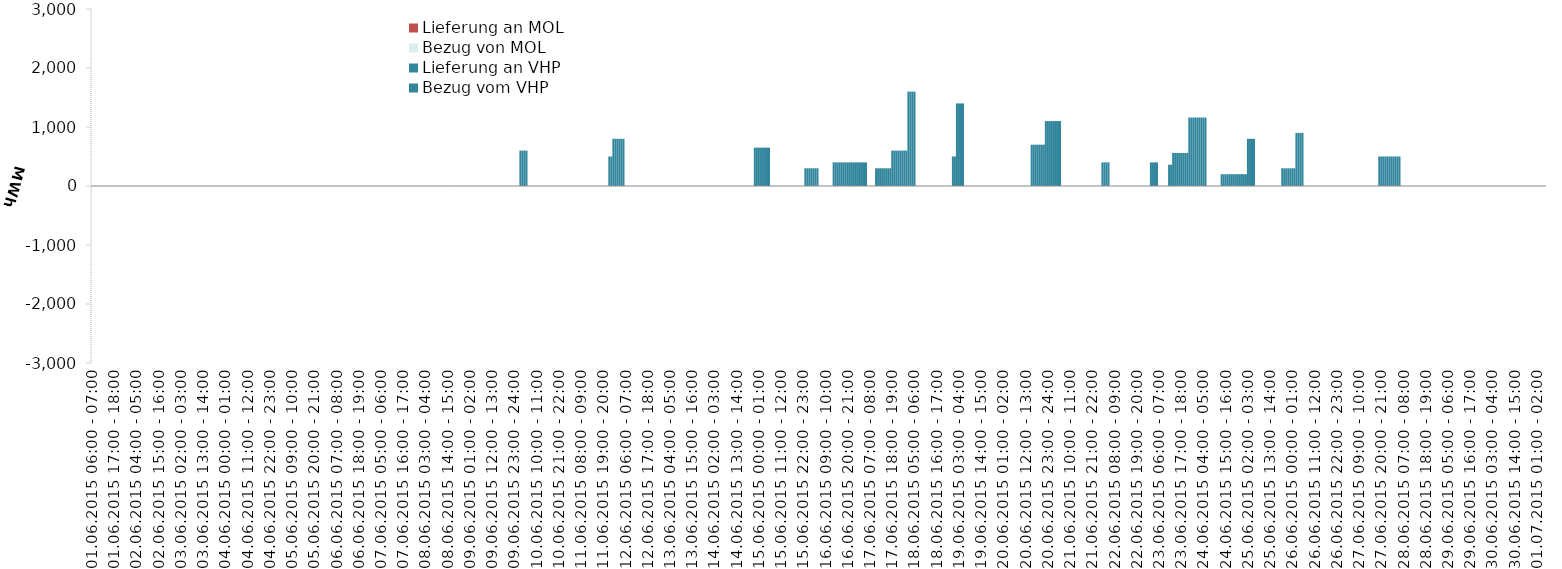
| Category | Bezug vom VHP | Lieferung an VHP | Bezug von MOL | Lieferung an MOL |
|---|---|---|---|---|
| 01.06.2015 06:00 - 07:00 | 0 | 0 | 0 | 0 |
| 01.06.2015 07:00 - 08:00 | 0 | 0 | 0 | 0 |
| 01.06.2015 08:00 - 09:00 | 0 | 0 | 0 | 0 |
| 01.06.2015 09:00 - 10:00 | 0 | 0 | 0 | 0 |
| 01.06.2015 10:00 - 11:00 | 0 | 0 | 0 | 0 |
| 01.06.2015 11:00 - 12:00 | 0 | 0 | 0 | 0 |
| 01.06.2015 12:00 - 13:00 | 0 | 0 | 0 | 0 |
| 01.06.2015 13:00 - 14:00 | 0 | 0 | 0 | 0 |
| 01.06.2015 14:00 - 15:00 | 0 | 0 | 0 | 0 |
| 01.06.2015 15:00 - 16:00 | 0 | 0 | 0 | 0 |
| 01.06.2015 16:00 - 17:00 | 0 | 0 | 0 | 0 |
| 01.06.2015 17:00 - 18:00 | 0 | 0 | 0 | 0 |
| 01.06.2015 18:00 - 19:00 | 0 | 0 | 0 | 0 |
| 01.06.2015 19:00 - 20:00 | 0 | 0 | 0 | 0 |
| 01.06.2015 20:00 - 21:00 | 0 | 0 | 0 | 0 |
| 01.06.2015 21:00 - 22:00 | 0 | 0 | 0 | 0 |
| 01.06.2015 22:00 - 23:00 | 0 | 0 | 0 | 0 |
| 01.06.2015 23:00 - 24:00 | 0 | 0 | 0 | 0 |
| 02.06.2015 00:00 - 01:00 | 0 | 0 | 0 | 0 |
| 02.06.2015 01:00 - 02:00 | 0 | 0 | 0 | 0 |
| 02.06.2015 02:00 - 03:00 | 0 | 0 | 0 | 0 |
| 02.06.2015 03:00 - 04:00 | 0 | 0 | 0 | 0 |
| 02.06.2015 04:00 - 05:00 | 0 | 0 | 0 | 0 |
| 02.06.2015 05:00 - 06:00 | 0 | 0 | 0 | 0 |
| 02.06.2015 06:00 - 07:00 | 0 | 0 | 0 | 0 |
| 02.06.2015 07:00 - 08:00 | 0 | 0 | 0 | 0 |
| 02.06.2015 08:00 - 09:00 | 0 | 0 | 0 | 0 |
| 02.06.2015 09:00 - 10:00 | 0 | 0 | 0 | 0 |
| 02.06.2015 10:00 - 11:00 | 0 | 0 | 0 | 0 |
| 02.06.2015 11:00 - 12:00 | 0 | 0 | 0 | 0 |
| 02.06.2015 12:00 - 13:00 | 0 | 0 | 0 | 0 |
| 02.06.2015 13:00 - 14:00 | 0 | 0 | 0 | 0 |
| 02.06.2015 14:00 - 15:00 | 0 | 0 | 0 | 0 |
| 02.06.2015 15:00 - 16:00 | 0 | 0 | 0 | 0 |
| 02.06.2015 16:00 - 17:00 | 0 | 0 | 0 | 0 |
| 02.06.2015 17:00 - 18:00 | 0 | 0 | 0 | 0 |
| 02.06.2015 18:00 - 19:00 | 0 | 0 | 0 | 0 |
| 02.06.2015 19:00 - 20:00 | 0 | 0 | 0 | 0 |
| 02.06.2015 20:00 - 21:00 | 0 | 0 | 0 | 0 |
| 02.06.2015 21:00 - 22:00 | 0 | 0 | 0 | 0 |
| 02.06.2015 22:00 - 23:00 | 0 | 0 | 0 | 0 |
| 02.06.2015 23:00 - 24:00 | 0 | 0 | 0 | 0 |
| 03.06.2015 00:00 - 01:00 | 0 | 0 | 0 | 0 |
| 03.06.2015 01:00 - 02:00 | 0 | 0 | 0 | 0 |
| 03.06.2015 02:00 - 03:00 | 0 | 0 | 0 | 0 |
| 03.06.2015 03:00 - 04:00 | 0 | 0 | 0 | 0 |
| 03.06.2015 04:00 - 05:00 | 0 | 0 | 0 | 0 |
| 03.06.2015 05:00 - 06:00 | 0 | 0 | 0 | 0 |
| 03.06.2015 06:00 - 07:00 | 0 | 0 | 0 | 0 |
| 03.06.2015 07:00 - 08:00 | 0 | 0 | 0 | 0 |
| 03.06.2015 08:00 - 09:00 | 0 | 0 | 0 | 0 |
| 03.06.2015 09:00 - 10:00 | 0 | 0 | 0 | 0 |
| 03.06.2015 10:00 - 11:00 | 0 | 0 | 0 | 0 |
| 03.06.2015 11:00 - 12:00 | 0 | 0 | 0 | 0 |
| 03.06.2015 12:00 - 13:00 | 0 | 0 | 0 | 0 |
| 03.06.2015 13:00 - 14:00 | 0 | 0 | 0 | 0 |
| 03.06.2015 14:00 - 15:00 | 0 | 0 | 0 | 0 |
| 03.06.2015 15:00 - 16:00 | 0 | 0 | 0 | 0 |
| 03.06.2015 16:00 - 17:00 | 0 | 0 | 0 | 0 |
| 03.06.2015 17:00 - 18:00 | 0 | 0 | 0 | 0 |
| 03.06.2015 18:00 - 19:00 | 0 | 0 | 0 | 0 |
| 03.06.2015 19:00 - 20:00 | 0 | 0 | 0 | 0 |
| 03.06.2015 20:00 - 21:00 | 0 | 0 | 0 | 0 |
| 03.06.2015 21:00 - 22:00 | 0 | 0 | 0 | 0 |
| 03.06.2015 22:00 - 23:00 | 0 | 0 | 0 | 0 |
| 03.06.2015 23:00 - 24:00 | 0 | 0 | 0 | 0 |
| 04.06.2015 00:00 - 01:00 | 0 | 0 | 0 | 0 |
| 04.06.2015 01:00 - 02:00 | 0 | 0 | 0 | 0 |
| 04.06.2015 02:00 - 03:00 | 0 | 0 | 0 | 0 |
| 04.06.2015 03:00 - 04:00 | 0 | 0 | 0 | 0 |
| 04.06.2015 04:00 - 05:00 | 0 | 0 | 0 | 0 |
| 04.06.2015 05:00 - 06:00 | 0 | 0 | 0 | 0 |
| 04.06.2015 06:00 - 07:00 | 0 | 0 | 0 | 0 |
| 04.06.2015 07:00 - 08:00 | 0 | 0 | 0 | 0 |
| 04.06.2015 08:00 - 09:00 | 0 | 0 | 0 | 0 |
| 04.06.2015 09:00 - 10:00 | 0 | 0 | 0 | 0 |
| 04.06.2015 10:00 - 11:00 | 0 | 0 | 0 | 0 |
| 04.06.2015 11:00 - 12:00 | 0 | 0 | 0 | 0 |
| 04.06.2015 12:00 - 13:00 | 0 | 0 | 0 | 0 |
| 04.06.2015 13:00 - 14:00 | 0 | 0 | 0 | 0 |
| 04.06.2015 14:00 - 15:00 | 0 | 0 | 0 | 0 |
| 04.06.2015 15:00 - 16:00 | 0 | 0 | 0 | 0 |
| 04.06.2015 16:00 - 17:00 | 0 | 0 | 0 | 0 |
| 04.06.2015 17:00 - 18:00 | 0 | 0 | 0 | 0 |
| 04.06.2015 18:00 - 19:00 | 0 | 0 | 0 | 0 |
| 04.06.2015 19:00 - 20:00 | 0 | 0 | 0 | 0 |
| 04.06.2015 20:00 - 21:00 | 0 | 0 | 0 | 0 |
| 04.06.2015 21:00 - 22:00 | 0 | 0 | 0 | 0 |
| 04.06.2015 22:00 - 23:00 | 0 | 0 | 0 | 0 |
| 04.06.2015 23:00 - 24:00 | 0 | 0 | 0 | 0 |
| 05.06.2015 00:00 - 01:00 | 0 | 0 | 0 | 0 |
| 05.06.2015 01:00 - 02:00 | 0 | 0 | 0 | 0 |
| 05.06.2015 02:00 - 03:00 | 0 | 0 | 0 | 0 |
| 05.06.2015 03:00 - 04:00 | 0 | 0 | 0 | 0 |
| 05.06.2015 04:00 - 05:00 | 0 | 0 | 0 | 0 |
| 05.06.2015 05:00 - 06:00 | 0 | 0 | 0 | 0 |
| 05.06.2015 06:00 - 07:00 | 0 | 0 | 0 | 0 |
| 05.06.2015 07:00 - 08:00 | 0 | 0 | 0 | 0 |
| 05.06.2015 08:00 - 09:00 | 0 | 0 | 0 | 0 |
| 05.06.2015 09:00 - 10:00 | 0 | 0 | 0 | 0 |
| 05.06.2015 10:00 - 11:00 | 0 | 0 | 0 | 0 |
| 05.06.2015 11:00 - 12:00 | 0 | 0 | 0 | 0 |
| 05.06.2015 12:00 - 13:00 | 0 | 0 | 0 | 0 |
| 05.06.2015 13:00 - 14:00 | 0 | 0 | 0 | 0 |
| 05.06.2015 14:00 - 15:00 | 0 | 0 | 0 | 0 |
| 05.06.2015 15:00 - 16:00 | 0 | 0 | 0 | 0 |
| 05.06.2015 16:00 - 17:00 | 0 | 0 | 0 | 0 |
| 05.06.2015 17:00 - 18:00 | 0 | 0 | 0 | 0 |
| 05.06.2015 18:00 - 19:00 | 0 | 0 | 0 | 0 |
| 05.06.2015 19:00 - 20:00 | 0 | 0 | 0 | 0 |
| 05.06.2015 20:00 - 21:00 | 0 | 0 | 0 | 0 |
| 05.06.2015 21:00 - 22:00 | 0 | 0 | 0 | 0 |
| 05.06.2015 22:00 - 23:00 | 0 | 0 | 0 | 0 |
| 05.06.2015 23:00 - 24:00 | 0 | 0 | 0 | 0 |
| 06.06.2015 00:00 - 01:00 | 0 | 0 | 0 | 0 |
| 06.06.2015 01:00 - 02:00 | 0 | 0 | 0 | 0 |
| 06.06.2015 02:00 - 03:00 | 0 | 0 | 0 | 0 |
| 06.06.2015 03:00 - 04:00 | 0 | 0 | 0 | 0 |
| 06.06.2015 04:00 - 05:00 | 0 | 0 | 0 | 0 |
| 06.06.2015 05:00 - 06:00 | 0 | 0 | 0 | 0 |
| 06.06.2015 06:00 - 07:00 | 0 | 0 | 0 | 0 |
| 06.06.2015 07:00 - 08:00 | 0 | 0 | 0 | 0 |
| 06.06.2015 08:00 - 09:00 | 0 | 0 | 0 | 0 |
| 06.06.2015 09:00 - 10:00 | 0 | 0 | 0 | 0 |
| 06.06.2015 10:00 - 11:00 | 0 | 0 | 0 | 0 |
| 06.06.2015 11:00 - 12:00 | 0 | 0 | 0 | 0 |
| 06.06.2015 12:00 - 13:00 | 0 | 0 | 0 | 0 |
| 06.06.2015 13:00 - 14:00 | 0 | 0 | 0 | 0 |
| 06.06.2015 14:00 - 15:00 | 0 | 0 | 0 | 0 |
| 06.06.2015 15:00 - 16:00 | 0 | 0 | 0 | 0 |
| 06.06.2015 16:00 - 17:00 | 0 | 0 | 0 | 0 |
| 06.06.2015 17:00 - 18:00 | 0 | 0 | 0 | 0 |
| 06.06.2015 18:00 - 19:00 | 0 | 0 | 0 | 0 |
| 06.06.2015 19:00 - 20:00 | 0 | 0 | 0 | 0 |
| 06.06.2015 20:00 - 21:00 | 0 | 0 | 0 | 0 |
| 06.06.2015 21:00 - 22:00 | 0 | 0 | 0 | 0 |
| 06.06.2015 22:00 - 23:00 | 0 | 0 | 0 | 0 |
| 06.06.2015 23:00 - 24:00 | 0 | 0 | 0 | 0 |
| 07.06.2015 00:00 - 01:00 | 0 | 0 | 0 | 0 |
| 07.06.2015 01:00 - 02:00 | 0 | 0 | 0 | 0 |
| 07.06.2015 02:00 - 03:00 | 0 | 0 | 0 | 0 |
| 07.06.2015 03:00 - 04:00 | 0 | 0 | 0 | 0 |
| 07.06.2015 04:00 - 05:00 | 0 | 0 | 0 | 0 |
| 07.06.2015 05:00 - 06:00 | 0 | 0 | 0 | 0 |
| 07.06.2015 06:00 - 07:00 | 0 | 0 | 0 | 0 |
| 07.06.2015 07:00 - 08:00 | 0 | 0 | 0 | 0 |
| 07.06.2015 08:00 - 09:00 | 0 | 0 | 0 | 0 |
| 07.06.2015 09:00 - 10:00 | 0 | 0 | 0 | 0 |
| 07.06.2015 10:00 - 11:00 | 0 | 0 | 0 | 0 |
| 07.06.2015 11:00 - 12:00 | 0 | 0 | 0 | 0 |
| 07.06.2015 12:00 - 13:00 | 0 | 0 | 0 | 0 |
| 07.06.2015 13:00 - 14:00 | 0 | 0 | 0 | 0 |
| 07.06.2015 14:00 - 15:00 | 0 | 0 | 0 | 0 |
| 07.06.2015 15:00 - 16:00 | 0 | 0 | 0 | 0 |
| 07.06.2015 16:00 - 17:00 | 0 | 0 | 0 | 0 |
| 07.06.2015 17:00 - 18:00 | 0 | 0 | 0 | 0 |
| 07.06.2015 18:00 - 19:00 | 0 | 0 | 0 | 0 |
| 07.06.2015 19:00 - 20:00 | 0 | 0 | 0 | 0 |
| 07.06.2015 20:00 - 21:00 | 0 | 0 | 0 | 0 |
| 07.06.2015 21:00 - 22:00 | 0 | 0 | 0 | 0 |
| 07.06.2015 22:00 - 23:00 | 0 | 0 | 0 | 0 |
| 07.06.2015 23:00 - 24:00 | 0 | 0 | 0 | 0 |
| 08.06.2015 00:00 - 01:00 | 0 | 0 | 0 | 0 |
| 08.06.2015 01:00 - 02:00 | 0 | 0 | 0 | 0 |
| 08.06.2015 02:00 - 03:00 | 0 | 0 | 0 | 0 |
| 08.06.2015 03:00 - 04:00 | 0 | 0 | 0 | 0 |
| 08.06.2015 04:00 - 05:00 | 0 | 0 | 0 | 0 |
| 08.06.2015 05:00 - 06:00 | 0 | 0 | 0 | 0 |
| 08.06.2015 06:00 - 07:00 | 0 | 0 | 0 | 0 |
| 08.06.2015 07:00 - 08:00 | 0 | 0 | 0 | 0 |
| 08.06.2015 08:00 - 09:00 | 0 | 0 | 0 | 0 |
| 08.06.2015 09:00 - 10:00 | 0 | 0 | 0 | 0 |
| 08.06.2015 10:00 - 11:00 | 0 | 0 | 0 | 0 |
| 08.06.2015 11:00 - 12:00 | 0 | 0 | 0 | 0 |
| 08.06.2015 12:00 - 13:00 | 0 | 0 | 0 | 0 |
| 08.06.2015 13:00 - 14:00 | 0 | 0 | 0 | 0 |
| 08.06.2015 14:00 - 15:00 | 0 | 0 | 0 | 0 |
| 08.06.2015 15:00 - 16:00 | 0 | 0 | 0 | 0 |
| 08.06.2015 16:00 - 17:00 | 0 | 0 | 0 | 0 |
| 08.06.2015 17:00 - 18:00 | 0 | 0 | 0 | 0 |
| 08.06.2015 18:00 - 19:00 | 0 | 0 | 0 | 0 |
| 08.06.2015 19:00 - 20:00 | 0 | 0 | 0 | 0 |
| 08.06.2015 20:00 - 21:00 | 0 | 0 | 0 | 0 |
| 08.06.2015 21:00 - 22:00 | 0 | 0 | 0 | 0 |
| 08.06.2015 22:00 - 23:00 | 0 | 0 | 0 | 0 |
| 08.06.2015 23:00 - 24:00 | 0 | 0 | 0 | 0 |
| 09.06.2015 00:00 - 01:00 | 0 | 0 | 0 | 0 |
| 09.06.2015 01:00 - 02:00 | 0 | 0 | 0 | 0 |
| 09.06.2015 02:00 - 03:00 | 0 | 0 | 0 | 0 |
| 09.06.2015 03:00 - 04:00 | 0 | 0 | 0 | 0 |
| 09.06.2015 04:00 - 05:00 | 0 | 0 | 0 | 0 |
| 09.06.2015 05:00 - 06:00 | 0 | 0 | 0 | 0 |
| 09.06.2015 06:00 - 07:00 | 0 | 0 | 0 | 0 |
| 09.06.2015 07:00 - 08:00 | 0 | 0 | 0 | 0 |
| 09.06.2015 08:00 - 09:00 | 0 | 0 | 0 | 0 |
| 09.06.2015 09:00 - 10:00 | 0 | 0 | 0 | 0 |
| 09.06.2015 10:00 - 11:00 | 0 | 0 | 0 | 0 |
| 09.06.2015 11:00 - 12:00 | 0 | 0 | 0 | 0 |
| 09.06.2015 12:00 - 13:00 | 0 | 0 | 0 | 0 |
| 09.06.2015 13:00 - 14:00 | 0 | 0 | 0 | 0 |
| 09.06.2015 14:00 - 15:00 | 0 | 0 | 0 | 0 |
| 09.06.2015 15:00 - 16:00 | 0 | 0 | 0 | 0 |
| 09.06.2015 16:00 - 17:00 | 0 | 0 | 0 | 0 |
| 09.06.2015 17:00 - 18:00 | 0 | 0 | 0 | 0 |
| 09.06.2015 18:00 - 19:00 | 0 | 0 | 0 | 0 |
| 09.06.2015 19:00 - 20:00 | 0 | 0 | 0 | 0 |
| 09.06.2015 20:00 - 21:00 | 0 | 0 | 0 | 0 |
| 09.06.2015 21:00 - 22:00 | 0 | 0 | 0 | 0 |
| 09.06.2015 22:00 - 23:00 | 0 | 0 | 0 | 0 |
| 09.06.2015 23:00 - 24:00 | 0 | 0 | 0 | 0 |
| 10.06.2015 00:00 - 01:00 | 0 | 0 | 0 | 0 |
| 10.06.2015 01:00 - 02:00 | 0 | 0 | 0 | 0 |
| 10.06.2015 02:00 - 03:00 | 600 | 0 | 0 | 0 |
| 10.06.2015 03:00 - 04:00 | 600 | 0 | 0 | 0 |
| 10.06.2015 04:00 - 05:00 | 600 | 0 | 0 | 0 |
| 10.06.2015 05:00 - 06:00 | 600 | 0 | 0 | 0 |
| 10.06.2015 06:00 - 07:00 | 0 | 0 | 0 | 0 |
| 10.06.2015 07:00 - 08:00 | 0 | 0 | 0 | 0 |
| 10.06.2015 08:00 - 09:00 | 0 | 0 | 0 | 0 |
| 10.06.2015 09:00 - 10:00 | 0 | 0 | 0 | 0 |
| 10.06.2015 10:00 - 11:00 | 0 | 0 | 0 | 0 |
| 10.06.2015 11:00 - 12:00 | 0 | 0 | 0 | 0 |
| 10.06.2015 12:00 - 13:00 | 0 | 0 | 0 | 0 |
| 10.06.2015 13:00 - 14:00 | 0 | 0 | 0 | 0 |
| 10.06.2015 14:00 - 15:00 | 0 | 0 | 0 | 0 |
| 10.06.2015 15:00 - 16:00 | 0 | 0 | 0 | 0 |
| 10.06.2015 16:00 - 17:00 | 0 | 0 | 0 | 0 |
| 10.06.2015 17:00 - 18:00 | 0 | 0 | 0 | 0 |
| 10.06.2015 18:00 - 19:00 | 0 | 0 | 0 | 0 |
| 10.06.2015 19:00 - 20:00 | 0 | 0 | 0 | 0 |
| 10.06.2015 20:00 - 21:00 | 0 | 0 | 0 | 0 |
| 10.06.2015 21:00 - 22:00 | 0 | 0 | 0 | 0 |
| 10.06.2015 22:00 - 23:00 | 0 | 0 | 0 | 0 |
| 10.06.2015 23:00 - 24:00 | 0 | 0 | 0 | 0 |
| 11.06.2015 00:00 - 01:00 | 0 | 0 | 0 | 0 |
| 11.06.2015 01:00 - 02:00 | 0 | 0 | 0 | 0 |
| 11.06.2015 02:00 - 03:00 | 0 | 0 | 0 | 0 |
| 11.06.2015 03:00 - 04:00 | 0 | 0 | 0 | 0 |
| 11.06.2015 04:00 - 05:00 | 0 | 0 | 0 | 0 |
| 11.06.2015 05:00 - 06:00 | 0 | 0 | 0 | 0 |
| 11.06.2015 06:00 - 07:00 | 0 | 0 | 0 | 0 |
| 11.06.2015 07:00 - 08:00 | 0 | 0 | 0 | 0 |
| 11.06.2015 08:00 - 09:00 | 0 | 0 | 0 | 0 |
| 11.06.2015 09:00 - 10:00 | 0 | 0 | 0 | 0 |
| 11.06.2015 10:00 - 11:00 | 0 | 0 | 0 | 0 |
| 11.06.2015 11:00 - 12:00 | 0 | 0 | 0 | 0 |
| 11.06.2015 12:00 - 13:00 | 0 | 0 | 0 | 0 |
| 11.06.2015 13:00 - 14:00 | 0 | 0 | 0 | 0 |
| 11.06.2015 14:00 - 15:00 | 0 | 0 | 0 | 0 |
| 11.06.2015 15:00 - 16:00 | 0 | 0 | 0 | 0 |
| 11.06.2015 16:00 - 17:00 | 0 | 0 | 0 | 0 |
| 11.06.2015 17:00 - 18:00 | 0 | 0 | 0 | 0 |
| 11.06.2015 18:00 - 19:00 | 0 | 0 | 0 | 0 |
| 11.06.2015 19:00 - 20:00 | 0 | 0 | 0 | 0 |
| 11.06.2015 20:00 - 21:00 | 0 | 0 | 0 | 0 |
| 11.06.2015 21:00 - 22:00 | 0 | 0 | 0 | 0 |
| 11.06.2015 22:00 - 23:00 | 500 | 0 | 0 | 0 |
| 11.06.2015 23:00 - 24:00 | 500 | 0 | 0 | 0 |
| 12.06.2015 00:00 - 01:00 | 800 | 0 | 0 | 0 |
| 12.06.2015 01:00 - 02:00 | 800 | 0 | 0 | 0 |
| 12.06.2015 02:00 - 03:00 | 800 | 0 | 0 | 0 |
| 12.06.2015 03:00 - 04:00 | 800 | 0 | 0 | 0 |
| 12.06.2015 04:00 - 05:00 | 800 | 0 | 0 | 0 |
| 12.06.2015 05:00 - 06:00 | 800 | 0 | 0 | 0 |
| 12.06.2015 06:00 - 07:00 | 0 | 0 | 0 | 0 |
| 12.06.2015 07:00 - 08:00 | 0 | 0 | 0 | 0 |
| 12.06.2015 08:00 - 09:00 | 0 | 0 | 0 | 0 |
| 12.06.2015 09:00 - 10:00 | 0 | 0 | 0 | 0 |
| 12.06.2015 10:00 - 11:00 | 0 | 0 | 0 | 0 |
| 12.06.2015 11:00 - 12:00 | 0 | 0 | 0 | 0 |
| 12.06.2015 12:00 - 13:00 | 0 | 0 | 0 | 0 |
| 12.06.2015 13:00 - 14:00 | 0 | 0 | 0 | 0 |
| 12.06.2015 14:00 - 15:00 | 0 | 0 | 0 | 0 |
| 12.06.2015 15:00 - 16:00 | 0 | 0 | 0 | 0 |
| 12.06.2015 16:00 - 17:00 | 0 | 0 | 0 | 0 |
| 12.06.2015 17:00 - 18:00 | 0 | 0 | 0 | 0 |
| 12.06.2015 18:00 - 19:00 | 0 | 0 | 0 | 0 |
| 12.06.2015 19:00 - 20:00 | 0 | 0 | 0 | 0 |
| 12.06.2015 20:00 - 21:00 | 0 | 0 | 0 | 0 |
| 12.06.2015 21:00 - 22:00 | 0 | 0 | 0 | 0 |
| 12.06.2015 22:00 - 23:00 | 0 | 0 | 0 | 0 |
| 12.06.2015 23:00 - 24:00 | 0 | 0 | 0 | 0 |
| 13.06.2015 00:00 - 01:00 | 0 | 0 | 0 | 0 |
| 13.06.2015 01:00 - 02:00 | 0 | 0 | 0 | 0 |
| 13.06.2015 02:00 - 03:00 | 0 | 0 | 0 | 0 |
| 13.06.2015 03:00 - 04:00 | 0 | 0 | 0 | 0 |
| 13.06.2015 04:00 - 05:00 | 0 | 0 | 0 | 0 |
| 13.06.2015 05:00 - 06:00 | 0 | 0 | 0 | 0 |
| 13.06.2015 06:00 - 07:00 | 0 | 0 | 0 | 0 |
| 13.06.2015 07:00 - 08:00 | 0 | 0 | 0 | 0 |
| 13.06.2015 08:00 - 09:00 | 0 | 0 | 0 | 0 |
| 13.06.2015 09:00 - 10:00 | 0 | 0 | 0 | 0 |
| 13.06.2015 10:00 - 11:00 | 0 | 0 | 0 | 0 |
| 13.06.2015 11:00 - 12:00 | 0 | 0 | 0 | 0 |
| 13.06.2015 12:00 - 13:00 | 0 | 0 | 0 | 0 |
| 13.06.2015 13:00 - 14:00 | 0 | 0 | 0 | 0 |
| 13.06.2015 14:00 - 15:00 | 0 | 0 | 0 | 0 |
| 13.06.2015 15:00 - 16:00 | 0 | 0 | 0 | 0 |
| 13.06.2015 16:00 - 17:00 | 0 | 0 | 0 | 0 |
| 13.06.2015 17:00 - 18:00 | 0 | 0 | 0 | 0 |
| 13.06.2015 18:00 - 19:00 | 0 | 0 | 0 | 0 |
| 13.06.2015 19:00 - 20:00 | 0 | 0 | 0 | 0 |
| 13.06.2015 20:00 - 21:00 | 0 | 0 | 0 | 0 |
| 13.06.2015 21:00 - 22:00 | 0 | 0 | 0 | 0 |
| 13.06.2015 22:00 - 23:00 | 0 | 0 | 0 | 0 |
| 13.06.2015 23:00 - 24:00 | 0 | 0 | 0 | 0 |
| 14.06.2015 00:00 - 01:00 | 0 | 0 | 0 | 0 |
| 14.06.2015 01:00 - 02:00 | 0 | 0 | 0 | 0 |
| 14.06.2015 02:00 - 03:00 | 0 | 0 | 0 | 0 |
| 14.06.2015 03:00 - 04:00 | 0 | 0 | 0 | 0 |
| 14.06.2015 04:00 - 05:00 | 0 | 0 | 0 | 0 |
| 14.06.2015 05:00 - 06:00 | 0 | 0 | 0 | 0 |
| 14.06.2015 06:00 - 07:00 | 0 | 0 | 0 | 0 |
| 14.06.2015 07:00 - 08:00 | 0 | 0 | 0 | 0 |
| 14.06.2015 08:00 - 09:00 | 0 | 0 | 0 | 0 |
| 14.06.2015 09:00 - 10:00 | 0 | 0 | 0 | 0 |
| 14.06.2015 10:00 - 11:00 | 0 | 0 | 0 | 0 |
| 14.06.2015 11:00 - 12:00 | 0 | 0 | 0 | 0 |
| 14.06.2015 12:00 - 13:00 | 0 | 0 | 0 | 0 |
| 14.06.2015 13:00 - 14:00 | 0 | 0 | 0 | 0 |
| 14.06.2015 14:00 - 15:00 | 0 | 0 | 0 | 0 |
| 14.06.2015 15:00 - 16:00 | 0 | 0 | 0 | 0 |
| 14.06.2015 16:00 - 17:00 | 0 | 0 | 0 | 0 |
| 14.06.2015 17:00 - 18:00 | 0 | 0 | 0 | 0 |
| 14.06.2015 18:00 - 19:00 | 0 | 0 | 0 | 0 |
| 14.06.2015 19:00 - 20:00 | 0 | 0 | 0 | 0 |
| 14.06.2015 20:00 - 21:00 | 0 | 0 | 0 | 0 |
| 14.06.2015 21:00 - 22:00 | 0 | 0 | 0 | 0 |
| 14.06.2015 22:00 - 23:00 | 650 | 0 | 0 | 0 |
| 14.06.2015 23:00 - 24:00 | 650 | 0 | 0 | 0 |
| 15.06.2015 00:00 - 01:00 | 650 | 0 | 0 | 0 |
| 15.06.2015 01:00 - 02:00 | 650 | 0 | 0 | 0 |
| 15.06.2015 02:00 - 03:00 | 650 | 0 | 0 | 0 |
| 15.06.2015 03:00 - 04:00 | 650 | 0 | 0 | 0 |
| 15.06.2015 04:00 - 05:00 | 650 | 0 | 0 | 0 |
| 15.06.2015 05:00 - 06:00 | 650 | 0 | 0 | 0 |
| 15.06.2015 06:00 - 07:00 | 0 | 0 | 0 | 0 |
| 15.06.2015 07:00 - 08:00 | 0 | 0 | 0 | 0 |
| 15.06.2015 08:00 - 09:00 | 0 | 0 | 0 | 0 |
| 15.06.2015 09:00 - 10:00 | 0 | 0 | 0 | 0 |
| 15.06.2015 10:00 - 11:00 | 0 | 0 | 0 | 0 |
| 15.06.2015 11:00 - 12:00 | 0 | 0 | 0 | 0 |
| 15.06.2015 12:00 - 13:00 | 0 | 0 | 0 | 0 |
| 15.06.2015 13:00 - 14:00 | 0 | 0 | 0 | 0 |
| 15.06.2015 14:00 - 15:00 | 0 | 0 | 0 | 0 |
| 15.06.2015 15:00 - 16:00 | 0 | 0 | 0 | 0 |
| 15.06.2015 16:00 - 17:00 | 0 | 0 | 0 | 0 |
| 15.06.2015 17:00 - 18:00 | 0 | 0 | 0 | 0 |
| 15.06.2015 18:00 - 19:00 | 0 | 0 | 0 | 0 |
| 15.06.2015 19:00 - 20:00 | 0 | 0 | 0 | 0 |
| 15.06.2015 20:00 - 21:00 | 0 | 0 | 0 | 0 |
| 15.06.2015 21:00 - 22:00 | 0 | 0 | 0 | 0 |
| 15.06.2015 22:00 - 23:00 | 0 | 0 | 0 | 0 |
| 15.06.2015 23:00 - 24:00 | 300 | 0 | 0 | 0 |
| 16.06.2015 00:00 - 01:00 | 300 | 0 | 0 | 0 |
| 16.06.2015 01:00 - 02:00 | 300 | 0 | 0 | 0 |
| 16.06.2015 02:00 - 03:00 | 300 | 0 | 0 | 0 |
| 16.06.2015 03:00 - 04:00 | 300 | 0 | 0 | 0 |
| 16.06.2015 04:00 - 05:00 | 300 | 0 | 0 | 0 |
| 16.06.2015 05:00 - 06:00 | 300 | 0 | 0 | 0 |
| 16.06.2015 06:00 - 07:00 | 0 | 0 | 0 | 0 |
| 16.06.2015 07:00 - 08:00 | 0 | 0 | 0 | 0 |
| 16.06.2015 08:00 - 09:00 | 0 | 0 | 0 | 0 |
| 16.06.2015 09:00 - 10:00 | 0 | 0 | 0 | 0 |
| 16.06.2015 10:00 - 11:00 | 0 | 0 | 0 | 0 |
| 16.06.2015 11:00 - 12:00 | 0 | 0 | 0 | 0 |
| 16.06.2015 12:00 - 13:00 | 0 | 0 | 0 | 0 |
| 16.06.2015 13:00 - 14:00 | 400 | 0 | 0 | 0 |
| 16.06.2015 14:00 - 15:00 | 400 | 0 | 0 | 0 |
| 16.06.2015 15:00 - 16:00 | 400 | 0 | 0 | 0 |
| 16.06.2015 16:00 - 17:00 | 400 | 0 | 0 | 0 |
| 16.06.2015 17:00 - 18:00 | 400 | 0 | 0 | 0 |
| 16.06.2015 18:00 - 19:00 | 400 | 0 | 0 | 0 |
| 16.06.2015 19:00 - 20:00 | 400 | 0 | 0 | 0 |
| 16.06.2015 20:00 - 21:00 | 400 | 0 | 0 | 0 |
| 16.06.2015 21:00 - 22:00 | 400 | 0 | 0 | 0 |
| 16.06.2015 22:00 - 23:00 | 400 | 0 | 0 | 0 |
| 16.06.2015 23:00 - 24:00 | 400 | 0 | 0 | 0 |
| 17.06.2015 00:00 - 01:00 | 400 | 0 | 0 | 0 |
| 17.06.2015 01:00 - 02:00 | 400 | 0 | 0 | 0 |
| 17.06.2015 02:00 - 03:00 | 400 | 0 | 0 | 0 |
| 17.06.2015 03:00 - 04:00 | 400 | 0 | 0 | 0 |
| 17.06.2015 04:00 - 05:00 | 400 | 0 | 0 | 0 |
| 17.06.2015 05:00 - 06:00 | 400 | 0 | 0 | 0 |
| 17.06.2015 06:00 - 07:00 | 0 | 0 | 0 | 0 |
| 17.06.2015 07:00 - 08:00 | 0 | 0 | 0 | 0 |
| 17.06.2015 08:00 - 09:00 | 0 | 0 | 0 | 0 |
| 17.06.2015 09:00 - 10:00 | 0 | 0 | 0 | 0 |
| 17.06.2015 10:00 - 11:00 | 300 | 0 | 0 | 0 |
| 17.06.2015 11:00 - 12:00 | 300 | 0 | 0 | 0 |
| 17.06.2015 12:00 - 13:00 | 300 | 0 | 0 | 0 |
| 17.06.2015 13:00 - 14:00 | 300 | 0 | 0 | 0 |
| 17.06.2015 14:00 - 15:00 | 300 | 0 | 0 | 0 |
| 17.06.2015 15:00 - 16:00 | 300 | 0 | 0 | 0 |
| 17.06.2015 16:00 - 17:00 | 300 | 0 | 0 | 0 |
| 17.06.2015 17:00 - 18:00 | 300 | 0 | 0 | 0 |
| 17.06.2015 18:00 - 19:00 | 600 | 0 | 0 | 0 |
| 17.06.2015 19:00 - 20:00 | 600 | 0 | 0 | 0 |
| 17.06.2015 20:00 - 21:00 | 600 | 0 | 0 | 0 |
| 17.06.2015 21:00 - 22:00 | 600 | 0 | 0 | 0 |
| 17.06.2015 22:00 - 23:00 | 600 | 0 | 0 | 0 |
| 17.06.2015 23:00 - 24:00 | 600 | 0 | 0 | 0 |
| 18.06.2015 00:00 - 01:00 | 600 | 0 | 0 | 0 |
| 18.06.2015 01:00 - 02:00 | 600 | 0 | 0 | 0 |
| 18.06.2015 02:00 - 03:00 | 1600 | 0 | 0 | 0 |
| 18.06.2015 03:00 - 04:00 | 1600 | 0 | 0 | 0 |
| 18.06.2015 04:00 - 05:00 | 1600 | 0 | 0 | 0 |
| 18.06.2015 05:00 - 06:00 | 1600 | 0 | 0 | 0 |
| 18.06.2015 06:00 - 07:00 | 0 | 0 | 0 | 0 |
| 18.06.2015 07:00 - 08:00 | 0 | 0 | 0 | 0 |
| 18.06.2015 08:00 - 09:00 | 0 | 0 | 0 | 0 |
| 18.06.2015 09:00 - 10:00 | 0 | 0 | 0 | 0 |
| 18.06.2015 10:00 - 11:00 | 0 | 0 | 0 | 0 |
| 18.06.2015 11:00 - 12:00 | 0 | 0 | 0 | 0 |
| 18.06.2015 12:00 - 13:00 | 0 | 0 | 0 | 0 |
| 18.06.2015 13:00 - 14:00 | 0 | 0 | 0 | 0 |
| 18.06.2015 14:00 - 15:00 | 0 | 0 | 0 | 0 |
| 18.06.2015 15:00 - 16:00 | 0 | 0 | 0 | 0 |
| 18.06.2015 16:00 - 17:00 | 0 | 0 | 0 | 0 |
| 18.06.2015 17:00 - 18:00 | 0 | 0 | 0 | 0 |
| 18.06.2015 18:00 - 19:00 | 0 | 0 | 0 | 0 |
| 18.06.2015 19:00 - 20:00 | 0 | 0 | 0 | 0 |
| 18.06.2015 20:00 - 21:00 | 0 | 0 | 0 | 0 |
| 18.06.2015 21:00 - 22:00 | 0 | 0 | 0 | 0 |
| 18.06.2015 22:00 - 23:00 | 0 | 0 | 0 | 0 |
| 18.06.2015 23:00 - 24:00 | 0 | 0 | 0 | 0 |
| 19.06.2015 00:00 - 01:00 | 500 | 0 | 0 | 0 |
| 19.06.2015 01:00 - 02:00 | 500 | 0 | 0 | 0 |
| 19.06.2015 02:00 - 03:00 | 1400 | 0 | 0 | 0 |
| 19.06.2015 03:00 - 04:00 | 1400 | 0 | 0 | 0 |
| 19.06.2015 04:00 - 05:00 | 1400 | 0 | 0 | 0 |
| 19.06.2015 05:00 - 06:00 | 1400 | 0 | 0 | 0 |
| 19.06.2015 06:00 - 07:00 | 0 | 0 | 0 | 0 |
| 19.06.2015 07:00 - 08:00 | 0 | 0 | 0 | 0 |
| 19.06.2015 08:00 - 09:00 | 0 | 0 | 0 | 0 |
| 19.06.2015 09:00 - 10:00 | 0 | 0 | 0 | 0 |
| 19.06.2015 10:00 - 11:00 | 0 | 0 | 0 | 0 |
| 19.06.2015 11:00 - 12:00 | 0 | 0 | 0 | 0 |
| 19.06.2015 12:00 - 13:00 | 0 | 0 | 0 | 0 |
| 19.06.2015 13:00 - 14:00 | 0 | 0 | 0 | 0 |
| 19.06.2015 14:00 - 15:00 | 0 | 0 | 0 | 0 |
| 19.06.2015 15:00 - 16:00 | 0 | 0 | 0 | 0 |
| 19.06.2015 16:00 - 17:00 | 0 | 0 | 0 | 0 |
| 19.06.2015 17:00 - 18:00 | 0 | 0 | 0 | 0 |
| 19.06.2015 18:00 - 19:00 | 0 | 0 | 0 | 0 |
| 19.06.2015 19:00 - 20:00 | 0 | 0 | 0 | 0 |
| 19.06.2015 20:00 - 21:00 | 0 | 0 | 0 | 0 |
| 19.06.2015 21:00 - 22:00 | 0 | 0 | 0 | 0 |
| 19.06.2015 22:00 - 23:00 | 0 | 0 | 0 | 0 |
| 19.06.2015 23:00 - 24:00 | 0 | 0 | 0 | 0 |
| 20.06.2015 00:00 - 01:00 | 0 | 0 | 0 | 0 |
| 20.06.2015 01:00 - 02:00 | 0 | 0 | 0 | 0 |
| 20.06.2015 02:00 - 03:00 | 0 | 0 | 0 | 0 |
| 20.06.2015 03:00 - 04:00 | 0 | 0 | 0 | 0 |
| 20.06.2015 04:00 - 05:00 | 0 | 0 | 0 | 0 |
| 20.06.2015 05:00 - 06:00 | 0 | 0 | 0 | 0 |
| 20.06.2015 06:00 - 07:00 | 0 | 0 | 0 | 0 |
| 20.06.2015 07:00 - 08:00 | 0 | 0 | 0 | 0 |
| 20.06.2015 08:00 - 09:00 | 0 | 0 | 0 | 0 |
| 20.06.2015 09:00 - 10:00 | 0 | 0 | 0 | 0 |
| 20.06.2015 10:00 - 11:00 | 0 | 0 | 0 | 0 |
| 20.06.2015 11:00 - 12:00 | 0 | 0 | 0 | 0 |
| 20.06.2015 12:00 - 13:00 | 0 | 0 | 0 | 0 |
| 20.06.2015 13:00 - 14:00 | 0 | 0 | 0 | 0 |
| 20.06.2015 14:00 - 15:00 | 0 | 0 | 0 | 0 |
| 20.06.2015 15:00 - 16:00 | 700 | 0 | 0 | 0 |
| 20.06.2015 16:00 - 17:00 | 700 | 0 | 0 | 0 |
| 20.06.2015 17:00 - 18:00 | 700 | 0 | 0 | 0 |
| 20.06.2015 18:00 - 19:00 | 700 | 0 | 0 | 0 |
| 20.06.2015 19:00 - 20:00 | 700 | 0 | 0 | 0 |
| 20.06.2015 20:00 - 21:00 | 700 | 0 | 0 | 0 |
| 20.06.2015 21:00 - 22:00 | 700 | 0 | 0 | 0 |
| 20.06.2015 22:00 - 23:00 | 1100 | 0 | 0 | 0 |
| 20.06.2015 23:00 - 24:00 | 1100 | 0 | 0 | 0 |
| 21.06.2015 00:00 - 01:00 | 1100 | 0 | 0 | 0 |
| 21.06.2015 01:00 - 02:00 | 1100 | 0 | 0 | 0 |
| 21.06.2015 02:00 - 03:00 | 1100 | 0 | 0 | 0 |
| 21.06.2015 03:00 - 04:00 | 1100 | 0 | 0 | 0 |
| 21.06.2015 04:00 - 05:00 | 1100 | 0 | 0 | 0 |
| 21.06.2015 05:00 - 06:00 | 1100 | 0 | 0 | 0 |
| 21.06.2015 06:00 - 07:00 | 0 | 0 | 0 | 0 |
| 21.06.2015 07:00 - 08:00 | 0 | 0 | 0 | 0 |
| 21.06.2015 08:00 - 09:00 | 0 | 0 | 0 | 0 |
| 21.06.2015 09:00 - 10:00 | 0 | 0 | 0 | 0 |
| 21.06.2015 10:00 - 11:00 | 0 | 0 | 0 | 0 |
| 21.06.2015 11:00 - 12:00 | 0 | 0 | 0 | 0 |
| 21.06.2015 12:00 - 13:00 | 0 | 0 | 0 | 0 |
| 21.06.2015 13:00 - 14:00 | 0 | 0 | 0 | 0 |
| 21.06.2015 14:00 - 15:00 | 0 | 0 | 0 | 0 |
| 21.06.2015 15:00 - 16:00 | 0 | 0 | 0 | 0 |
| 21.06.2015 16:00 - 17:00 | 0 | 0 | 0 | 0 |
| 21.06.2015 17:00 - 18:00 | 0 | 0 | 0 | 0 |
| 21.06.2015 18:00 - 19:00 | 0 | 0 | 0 | 0 |
| 21.06.2015 19:00 - 20:00 | 0 | 0 | 0 | 0 |
| 21.06.2015 20:00 - 21:00 | 0 | 0 | 0 | 0 |
| 21.06.2015 21:00 - 22:00 | 0 | 0 | 0 | 0 |
| 21.06.2015 22:00 - 23:00 | 0 | 0 | 0 | 0 |
| 21.06.2015 23:00 - 24:00 | 0 | 0 | 0 | 0 |
| 22.06.2015 00:00 - 01:00 | 0 | 0 | 0 | 0 |
| 22.06.2015 01:00 - 02:00 | 0 | 0 | 0 | 0 |
| 22.06.2015 02:00 - 03:00 | 400 | 0 | 0 | 0 |
| 22.06.2015 03:00 - 04:00 | 400 | 0 | 0 | 0 |
| 22.06.2015 04:00 - 05:00 | 400 | 0 | 0 | 0 |
| 22.06.2015 05:00 - 06:00 | 400 | 0 | 0 | 0 |
| 22.06.2015 06:00 - 07:00 | 0 | 0 | 0 | 0 |
| 22.06.2015 07:00 - 08:00 | 0 | 0 | 0 | 0 |
| 22.06.2015 08:00 - 09:00 | 0 | 0 | 0 | 0 |
| 22.06.2015 09:00 - 10:00 | 0 | 0 | 0 | 0 |
| 22.06.2015 10:00 - 11:00 | 0 | 0 | 0 | 0 |
| 22.06.2015 11:00 - 12:00 | 0 | 0 | 0 | 0 |
| 22.06.2015 12:00 - 13:00 | 0 | 0 | 0 | 0 |
| 22.06.2015 13:00 - 14:00 | 0 | 0 | 0 | 0 |
| 22.06.2015 14:00 - 15:00 | 0 | 0 | 0 | 0 |
| 22.06.2015 15:00 - 16:00 | 0 | 0 | 0 | 0 |
| 22.06.2015 16:00 - 17:00 | 0 | 0 | 0 | 0 |
| 22.06.2015 17:00 - 18:00 | 0 | 0 | 0 | 0 |
| 22.06.2015 18:00 - 19:00 | 0 | 0 | 0 | 0 |
| 22.06.2015 19:00 - 20:00 | 0 | 0 | 0 | 0 |
| 22.06.2015 20:00 - 21:00 | 0 | 0 | 0 | 0 |
| 22.06.2015 21:00 - 22:00 | 0 | 0 | 0 | 0 |
| 22.06.2015 22:00 - 23:00 | 0 | 0 | 0 | 0 |
| 22.06.2015 23:00 - 24:00 | 0 | 0 | 0 | 0 |
| 23.06.2015 00:00 - 01:00 | 0 | 0 | 0 | 0 |
| 23.06.2015 01:00 - 02:00 | 0 | 0 | 0 | 0 |
| 23.06.2015 02:00 - 03:00 | 400 | 0 | 0 | 0 |
| 23.06.2015 03:00 - 04:00 | 400 | 0 | 0 | 0 |
| 23.06.2015 04:00 - 05:00 | 400 | 0 | 0 | 0 |
| 23.06.2015 05:00 - 06:00 | 400 | 0 | 0 | 0 |
| 23.06.2015 06:00 - 07:00 | 0 | 0 | 0 | 0 |
| 23.06.2015 07:00 - 08:00 | 0 | 0 | 0 | 0 |
| 23.06.2015 08:00 - 09:00 | 0 | 0 | 0 | 0 |
| 23.06.2015 09:00 - 10:00 | 0 | 0 | 0 | 0 |
| 23.06.2015 10:00 - 11:00 | 0 | 0 | 0 | 0 |
| 23.06.2015 11:00 - 12:00 | 360 | 0 | 0 | 0 |
| 23.06.2015 12:00 - 13:00 | 360 | 0 | 0 | 0 |
| 23.06.2015 13:00 - 14:00 | 560 | 0 | 0 | 0 |
| 23.06.2015 14:00 - 15:00 | 560 | 0 | 0 | 0 |
| 23.06.2015 15:00 - 16:00 | 560 | 0 | 0 | 0 |
| 23.06.2015 16:00 - 17:00 | 560 | 0 | 0 | 0 |
| 23.06.2015 17:00 - 18:00 | 560 | 0 | 0 | 0 |
| 23.06.2015 18:00 - 19:00 | 560 | 0 | 0 | 0 |
| 23.06.2015 19:00 - 20:00 | 560 | 0 | 0 | 0 |
| 23.06.2015 20:00 - 21:00 | 560 | 0 | 0 | 0 |
| 23.06.2015 21:00 - 22:00 | 1160 | 0 | 0 | 0 |
| 23.06.2015 22:00 - 23:00 | 1160 | 0 | 0 | 0 |
| 23.06.2015 23:00 - 24:00 | 1160 | 0 | 0 | 0 |
| 24.06.2015 00:00 - 01:00 | 1160 | 0 | 0 | 0 |
| 24.06.2015 01:00 - 02:00 | 1160 | 0 | 0 | 0 |
| 24.06.2015 02:00 - 03:00 | 1160 | 0 | 0 | 0 |
| 24.06.2015 03:00 - 04:00 | 1160 | 0 | 0 | 0 |
| 24.06.2015 04:00 - 05:00 | 1160 | 0 | 0 | 0 |
| 24.06.2015 05:00 - 06:00 | 1160 | 0 | 0 | 0 |
| 24.06.2015 06:00 - 07:00 | 0 | 0 | 0 | 0 |
| 24.06.2015 07:00 - 08:00 | 0 | 0 | 0 | 0 |
| 24.06.2015 08:00 - 09:00 | 0 | 0 | 0 | 0 |
| 24.06.2015 09:00 - 10:00 | 0 | 0 | 0 | 0 |
| 24.06.2015 10:00 - 11:00 | 0 | 0 | 0 | 0 |
| 24.06.2015 11:00 - 12:00 | 0 | 0 | 0 | 0 |
| 24.06.2015 12:00 - 13:00 | 0 | 0 | 0 | 0 |
| 24.06.2015 13:00 - 14:00 | 200 | 0 | 0 | 0 |
| 24.06.2015 14:00 - 15:00 | 200 | 0 | 0 | 0 |
| 24.06.2015 15:00 - 16:00 | 200 | 0 | 0 | 0 |
| 24.06.2015 16:00 - 17:00 | 200 | 0 | 0 | 0 |
| 24.06.2015 17:00 - 18:00 | 200 | 0 | 0 | 0 |
| 24.06.2015 18:00 - 19:00 | 200 | 0 | 0 | 0 |
| 24.06.2015 19:00 - 20:00 | 200 | 0 | 0 | 0 |
| 24.06.2015 20:00 - 21:00 | 200 | 0 | 0 | 0 |
| 24.06.2015 21:00 - 22:00 | 200 | 0 | 0 | 0 |
| 24.06.2015 22:00 - 23:00 | 200 | 0 | 0 | 0 |
| 24.06.2015 23:00 - 24:00 | 200 | 0 | 0 | 0 |
| 25.06.2015 00:00 - 01:00 | 200 | 0 | 0 | 0 |
| 25.06.2015 01:00 - 02:00 | 200 | 0 | 0 | 0 |
| 25.06.2015 02:00 - 03:00 | 800 | 0 | 0 | 0 |
| 25.06.2015 03:00 - 04:00 | 800 | 0 | 0 | 0 |
| 25.06.2015 04:00 - 05:00 | 800 | 0 | 0 | 0 |
| 25.06.2015 05:00 - 06:00 | 800 | 0 | 0 | 0 |
| 25.06.2015 06:00 - 07:00 | 0 | 0 | 0 | 0 |
| 25.06.2015 07:00 - 08:00 | 0 | 0 | 0 | 0 |
| 25.06.2015 08:00 - 09:00 | 0 | 0 | 0 | 0 |
| 25.06.2015 09:00 - 10:00 | 0 | 0 | 0 | 0 |
| 25.06.2015 10:00 - 11:00 | 0 | 0 | 0 | 0 |
| 25.06.2015 11:00 - 12:00 | 0 | 0 | 0 | 0 |
| 25.06.2015 12:00 - 13:00 | 0 | 0 | 0 | 0 |
| 25.06.2015 13:00 - 14:00 | 0 | 0 | 0 | 0 |
| 25.06.2015 14:00 - 15:00 | 0 | 0 | 0 | 0 |
| 25.06.2015 15:00 - 16:00 | 0 | 0 | 0 | 0 |
| 25.06.2015 16:00 - 17:00 | 0 | 0 | 0 | 0 |
| 25.06.2015 17:00 - 18:00 | 0 | 0 | 0 | 0 |
| 25.06.2015 18:00 - 19:00 | 0 | 0 | 0 | 0 |
| 25.06.2015 19:00 - 20:00 | 300 | 0 | 0 | 0 |
| 25.06.2015 20:00 - 21:00 | 300 | 0 | 0 | 0 |
| 25.06.2015 21:00 - 22:00 | 300 | 0 | 0 | 0 |
| 25.06.2015 22:00 - 23:00 | 300 | 0 | 0 | 0 |
| 25.06.2015 23:00 - 24:00 | 300 | 0 | 0 | 0 |
| 26.06.2015 00:00 - 01:00 | 300 | 0 | 0 | 0 |
| 26.06.2015 01:00 - 02:00 | 300 | 0 | 0 | 0 |
| 26.06.2015 02:00 - 03:00 | 900 | 0 | 0 | 0 |
| 26.06.2015 03:00 - 04:00 | 900 | 0 | 0 | 0 |
| 26.06.2015 04:00 - 05:00 | 900 | 0 | 0 | 0 |
| 26.06.2015 05:00 - 06:00 | 900 | 0 | 0 | 0 |
| 26.06.2015 06:00 - 07:00 | 0 | 0 | 0 | 0 |
| 26.06.2015 07:00 - 08:00 | 0 | 0 | 0 | 0 |
| 26.06.2015 08:00 - 09:00 | 0 | 0 | 0 | 0 |
| 26.06.2015 09:00 - 10:00 | 0 | 0 | 0 | 0 |
| 26.06.2015 10:00 - 11:00 | 0 | 0 | 0 | 0 |
| 26.06.2015 11:00 - 12:00 | 0 | 0 | 0 | 0 |
| 26.06.2015 12:00 - 13:00 | 0 | 0 | 0 | 0 |
| 26.06.2015 13:00 - 14:00 | 0 | 0 | 0 | 0 |
| 26.06.2015 14:00 - 15:00 | 0 | 0 | 0 | 0 |
| 26.06.2015 15:00 - 16:00 | 0 | 0 | 0 | 0 |
| 26.06.2015 16:00 - 17:00 | 0 | 0 | 0 | 0 |
| 26.06.2015 17:00 - 18:00 | 0 | 0 | 0 | 0 |
| 26.06.2015 18:00 - 19:00 | 0 | 0 | 0 | 0 |
| 26.06.2015 19:00 - 20:00 | 0 | 0 | 0 | 0 |
| 26.06.2015 20:00 - 21:00 | 0 | 0 | 0 | 0 |
| 26.06.2015 21:00 - 22:00 | 0 | 0 | 0 | 0 |
| 26.06.2015 22:00 - 23:00 | 0 | 0 | 0 | 0 |
| 26.06.2015 23:00 - 24:00 | 0 | 0 | 0 | 0 |
| 27.06.2015 00:00 - 01:00 | 0 | 0 | 0 | 0 |
| 27.06.2015 01:00 - 02:00 | 0 | 0 | 0 | 0 |
| 27.06.2015 02:00 - 03:00 | 0 | 0 | 0 | 0 |
| 27.06.2015 03:00 - 04:00 | 0 | 0 | 0 | 0 |
| 27.06.2015 04:00 - 05:00 | 0 | 0 | 0 | 0 |
| 27.06.2015 05:00 - 06:00 | 0 | 0 | 0 | 0 |
| 27.06.2015 06:00 - 07:00 | 0 | 0 | 0 | 0 |
| 27.06.2015 07:00 - 08:00 | 0 | 0 | 0 | 0 |
| 27.06.2015 08:00 - 09:00 | 0 | 0 | 0 | 0 |
| 27.06.2015 09:00 - 10:00 | 0 | 0 | 0 | 0 |
| 27.06.2015 10:00 - 11:00 | 0 | 0 | 0 | 0 |
| 27.06.2015 11:00 - 12:00 | 0 | 0 | 0 | 0 |
| 27.06.2015 12:00 - 13:00 | 0 | 0 | 0 | 0 |
| 27.06.2015 13:00 - 14:00 | 0 | 0 | 0 | 0 |
| 27.06.2015 14:00 - 15:00 | 0 | 0 | 0 | 0 |
| 27.06.2015 15:00 - 16:00 | 0 | 0 | 0 | 0 |
| 27.06.2015 16:00 - 17:00 | 0 | 0 | 0 | 0 |
| 27.06.2015 17:00 - 18:00 | 0 | 0 | 0 | 0 |
| 27.06.2015 18:00 - 19:00 | 0 | 0 | 0 | 0 |
| 27.06.2015 19:00 - 20:00 | 500 | 0 | 0 | 0 |
| 27.06.2015 20:00 - 21:00 | 500 | 0 | 0 | 0 |
| 27.06.2015 21:00 - 22:00 | 500 | 0 | 0 | 0 |
| 27.06.2015 22:00 - 23:00 | 500 | 0 | 0 | 0 |
| 27.06.2015 23:00 - 24:00 | 500 | 0 | 0 | 0 |
| 28.06.2015 00:00 - 01:00 | 500 | 0 | 0 | 0 |
| 28.06.2015 01:00 - 02:00 | 500 | 0 | 0 | 0 |
| 28.06.2015 02:00 - 03:00 | 500 | 0 | 0 | 0 |
| 28.06.2015 03:00 - 04:00 | 500 | 0 | 0 | 0 |
| 28.06.2015 04:00 - 05:00 | 500 | 0 | 0 | 0 |
| 28.06.2015 05:00 - 06:00 | 500 | 0 | 0 | 0 |
| 28.06.2015 06:00 - 07:00 | 0 | 0 | 0 | 0 |
| 28.06.2015 07:00 - 08:00 | 0 | 0 | 0 | 0 |
| 28.06.2015 08:00 - 09:00 | 0 | 0 | 0 | 0 |
| 28.06.2015 09:00 - 10:00 | 0 | 0 | 0 | 0 |
| 28.06.2015 10:00 - 11:00 | 0 | 0 | 0 | 0 |
| 28.06.2015 11:00 - 12:00 | 0 | 0 | 0 | 0 |
| 28.06.2015 12:00 - 13:00 | 0 | 0 | 0 | 0 |
| 28.06.2015 13:00 - 14:00 | 0 | 0 | 0 | 0 |
| 28.06.2015 14:00 - 15:00 | 0 | 0 | 0 | 0 |
| 28.06.2015 15:00 - 16:00 | 0 | 0 | 0 | 0 |
| 28.06.2015 16:00 - 17:00 | 0 | 0 | 0 | 0 |
| 28.06.2015 17:00 - 18:00 | 0 | 0 | 0 | 0 |
| 28.06.2015 18:00 - 19:00 | 0 | 0 | 0 | 0 |
| 28.06.2015 19:00 - 20:00 | 0 | 0 | 0 | 0 |
| 28.06.2015 20:00 - 21:00 | 0 | 0 | 0 | 0 |
| 28.06.2015 21:00 - 22:00 | 0 | 0 | 0 | 0 |
| 28.06.2015 22:00 - 23:00 | 0 | 0 | 0 | 0 |
| 28.06.2015 23:00 - 24:00 | 0 | 0 | 0 | 0 |
| 29.06.2015 00:00 - 01:00 | 0 | 0 | 0 | 0 |
| 29.06.2015 01:00 - 02:00 | 0 | 0 | 0 | 0 |
| 29.06.2015 02:00 - 03:00 | 0 | 0 | 0 | 0 |
| 29.06.2015 03:00 - 04:00 | 0 | 0 | 0 | 0 |
| 29.06.2015 04:00 - 05:00 | 0 | 0 | 0 | 0 |
| 29.06.2015 05:00 - 06:00 | 0 | 0 | 0 | 0 |
| 29.06.2015 06:00 - 07:00 | 0 | 0 | 0 | 0 |
| 29.06.2015 07:00 - 08:00 | 0 | 0 | 0 | 0 |
| 29.06.2015 08:00 - 09:00 | 0 | 0 | 0 | 0 |
| 29.06.2015 09:00 - 10:00 | 0 | 0 | 0 | 0 |
| 29.06.2015 10:00 - 11:00 | 0 | 0 | 0 | 0 |
| 29.06.2015 11:00 - 12:00 | 0 | 0 | 0 | 0 |
| 29.06.2015 12:00 - 13:00 | 0 | 0 | 0 | 0 |
| 29.06.2015 13:00 - 14:00 | 0 | 0 | 0 | 0 |
| 29.06.2015 14:00 - 15:00 | 0 | 0 | 0 | 0 |
| 29.06.2015 15:00 - 16:00 | 0 | 0 | 0 | 0 |
| 29.06.2015 16:00 - 17:00 | 0 | 0 | 0 | 0 |
| 29.06.2015 17:00 - 18:00 | 0 | 0 | 0 | 0 |
| 29.06.2015 18:00 - 19:00 | 0 | 0 | 0 | 0 |
| 29.06.2015 19:00 - 20:00 | 0 | 0 | 0 | 0 |
| 29.06.2015 20:00 - 21:00 | 0 | 0 | 0 | 0 |
| 29.06.2015 21:00 - 22:00 | 0 | 0 | 0 | 0 |
| 29.06.2015 22:00 - 23:00 | 0 | 0 | 0 | 0 |
| 29.06.2015 23:00 - 24:00 | 0 | 0 | 0 | 0 |
| 30.06.2015 00:00 - 01:00 | 0 | 0 | 0 | 0 |
| 30.06.2015 01:00 - 02:00 | 0 | 0 | 0 | 0 |
| 30.06.2015 02:00 - 03:00 | 0 | 0 | 0 | 0 |
| 30.06.2015 03:00 - 04:00 | 0 | 0 | 0 | 0 |
| 30.06.2015 04:00 - 05:00 | 0 | 0 | 0 | 0 |
| 30.06.2015 05:00 - 06:00 | 0 | 0 | 0 | 0 |
| 30.06.2015 06:00 - 07:00 | 0 | 0 | 0 | 0 |
| 30.06.2015 07:00 - 08:00 | 0 | 0 | 0 | 0 |
| 30.06.2015 08:00 - 09:00 | 0 | 0 | 0 | 0 |
| 30.06.2015 09:00 - 10:00 | 0 | 0 | 0 | 0 |
| 30.06.2015 10:00 - 11:00 | 0 | 0 | 0 | 0 |
| 30.06.2015 11:00 - 12:00 | 0 | 0 | 0 | 0 |
| 30.06.2015 12:00 - 13:00 | 0 | 0 | 0 | 0 |
| 30.06.2015 13:00 - 14:00 | 0 | 0 | 0 | 0 |
| 30.06.2015 14:00 - 15:00 | 0 | 0 | 0 | 0 |
| 30.06.2015 15:00 - 16:00 | 0 | 0 | 0 | 0 |
| 30.06.2015 16:00 - 17:00 | 0 | 0 | 0 | 0 |
| 30.06.2015 17:00 - 18:00 | 0 | 0 | 0 | 0 |
| 30.06.2015 18:00 - 19:00 | 0 | 0 | 0 | 0 |
| 30.06.2015 19:00 - 20:00 | 0 | 0 | 0 | 0 |
| 30.06.2015 20:00 - 21:00 | 0 | 0 | 0 | 0 |
| 30.06.2015 21:00 - 22:00 | 0 | 0 | 0 | 0 |
| 30.06.2015 22:00 - 23:00 | 0 | 0 | 0 | 0 |
| 30.06.2015 23:00 - 24:00 | 0 | 0 | 0 | 0 |
| 01.07.2015 00:00 - 01:00 | 0 | 0 | 0 | 0 |
| 01.07.2015 01:00 - 02:00 | 0 | 0 | 0 | 0 |
| 01.07.2015 02:00 - 03:00 | 0 | 0 | 0 | 0 |
| 01.07.2015 03:00 - 04:00 | 0 | 0 | 0 | 0 |
| 01.07.2015 04:00 - 05:00 | 0 | 0 | 0 | 0 |
| 01.07.2015 05:00 - 06:00 | 0 | 0 | 0 | 0 |